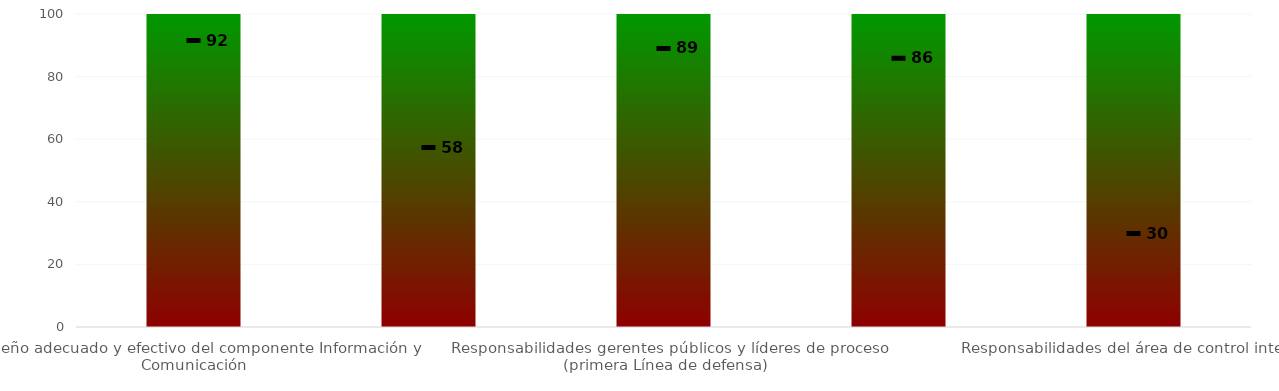
| Category | Niveles |
|---|---|
| Diseño adecuado y efectivo del componente Información y Comunicación | 100 |
| Responsabilidades de la Alta dirección y Comité Institucional de Coordinación de Control Interno (línea estratégica) | 100 |
| Responsabilidades gerentes públicos y líderes de proceso (primera Línea de defensa) | 100 |
| Responsabilidades de los servidores encargados del monitoreo y evaluación de controles y gestión del riesgo (segunda línea de defensa) | 100 |
| Responsabilidades del área de control interno | 100 |